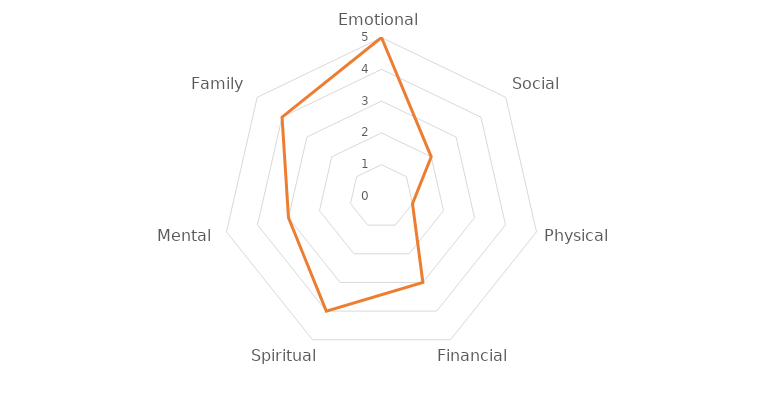
| Category | Status |
|---|---|
| Emotional | 5 |
| Social | 2 |
| Physical | 1 |
| Financial | 3 |
| Spiritual | 4 |
| Mental | 3 |
| Family | 4 |